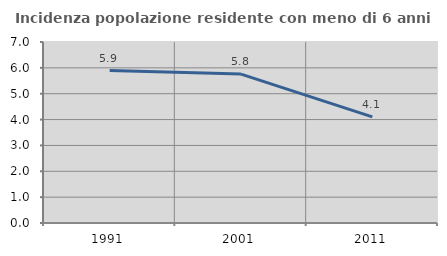
| Category | Incidenza popolazione residente con meno di 6 anni |
|---|---|
| 1991.0 | 5.894 |
| 2001.0 | 5.758 |
| 2011.0 | 4.106 |